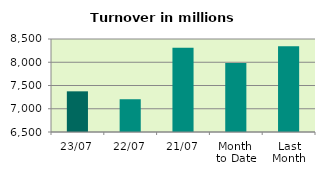
| Category | Series 0 |
|---|---|
| 23/07 | 7374.617 |
| 22/07 | 7204.561 |
| 21/07 | 8310.215 |
| Month 
to Date | 7983.818 |
| Last
Month | 8344.334 |